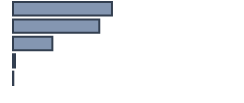
| Category | Series 0 |
|---|---|
| 0 | 43.595 |
| 1 | 38.007 |
| 2 | 17.341 |
| 3 | 0.921 |
| 4 | 0.135 |